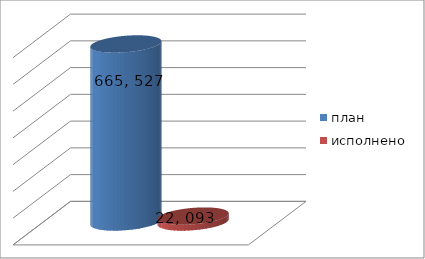
| Category | план | исполнено |
|---|---|---|
| 0 | 665527969 | 22093419.32 |